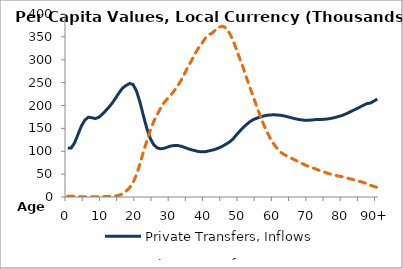
| Category | Private Transfers, Inflows | Private Transfers, Outflows |
|---|---|---|
| 0 | 106772.516 | 1768.943 |
|  | 107047.771 | 1618.705 |
| 2 | 118338.493 | 1308.319 |
| 3 | 137116.809 | 984.809 |
| 4 | 155432.478 | 714.118 |
| 5 | 168279.85 | 540.451 |
| 6 | 174393.681 | 500.596 |
| 7 | 173274.096 | 597.455 |
| 8 | 171427.268 | 726.342 |
| 9 | 173912.937 | 823.663 |
| 10 | 180404.959 | 948.097 |
| 11 | 188372.778 | 1099.228 |
| 12 | 196466.473 | 1232.339 |
| 13 | 205875.574 | 1503 |
| 14 | 217031.85 | 2323.006 |
| 15 | 228593.258 | 3923.878 |
| 16 | 238477.571 | 7207.892 |
| 17 | 243957.126 | 12734.552 |
| 18 | 248204.689 | 20255.204 |
| 19 | 245794.285 | 31406.597 |
| 20 | 231627.89 | 48548.577 |
| 21 | 207485.979 | 72342.712 |
| 22 | 177919.206 | 98365.689 |
| 23 | 149773.347 | 122657.077 |
| 24 | 128021.267 | 145454.917 |
| 25 | 114308.443 | 165023.85 |
| 26 | 107425.506 | 180025.347 |
| 27 | 105357.074 | 193733.777 |
| 28 | 106436.59 | 206019.411 |
| 29 | 109008.128 | 214867.266 |
| 30 | 111397.952 | 222943.601 |
| 31 | 112664.942 | 232385.904 |
| 32 | 112584.229 | 243312.256 |
| 33 | 110776.639 | 255400.224 |
| 34 | 108328.284 | 270041.903 |
| 35 | 105439.063 | 284845.392 |
| 36 | 103219.607 | 298338.74 |
| 37 | 101331.055 | 312905.467 |
| 38 | 99422.665 | 325393.293 |
| 39 | 98658.473 | 335749.313 |
| 40 | 98947.858 | 347095.264 |
| 41 | 100777.524 | 354242.358 |
| 42 | 102371.493 | 358513.132 |
| 43 | 104568.474 | 364930.528 |
| 44 | 107525.144 | 371144.62 |
| 45 | 111018.882 | 373357.706 |
| 46 | 115488.59 | 369589.758 |
| 47 | 120056.57 | 358424.253 |
| 48 | 126375.111 | 343918.447 |
| 49 | 135235.95 | 323688.24 |
| 50 | 143772.629 | 302847.411 |
| 51 | 151677.003 | 282732.77 |
| 52 | 158531.27 | 260394.473 |
| 53 | 164816.546 | 239243.109 |
| 54 | 169324.71 | 218080.151 |
| 55 | 172297.451 | 197010.836 |
| 56 | 175018.503 | 176313.814 |
| 57 | 177189.204 | 157636.366 |
| 58 | 178598.871 | 141062.48 |
| 59 | 179391.393 | 126535.309 |
| 60 | 179660.412 | 114713.016 |
| 61 | 179229.49 | 104981.507 |
| 62 | 178435.18 | 97407.665 |
| 63 | 177078.292 | 92237.97 |
| 64 | 175278.217 | 88473.484 |
| 65 | 173249.065 | 84795.85 |
| 66 | 171316.963 | 81178.037 |
| 67 | 169679.929 | 77401.664 |
| 68 | 168541.33 | 73828.442 |
| 69 | 167661.768 | 70118.373 |
| 70 | 167738.518 | 66747.823 |
| 71 | 168278.487 | 64125.381 |
| 72 | 169228.219 | 61644.008 |
| 73 | 169157.154 | 58515.389 |
| 74 | 169469.807 | 55969.854 |
| 75 | 170200.85 | 53347.333 |
| 76 | 171120.705 | 50872.848 |
| 77 | 172525.444 | 48743.685 |
| 78 | 174374.281 | 46985.099 |
| 79 | 176471.388 | 45380.551 |
| 80 | 178933.302 | 44064.006 |
| 81 | 182024.451 | 42081.827 |
| 82 | 185631.488 | 39959.332 |
| 83 | 189305.778 | 37928.215 |
| 84 | 192991.208 | 35980.419 |
| 85 | 196784.762 | 33821.391 |
| 86 | 200553.305 | 31620.004 |
| 87 | 204323.026 | 29365.12 |
| 88 | 205330.161 | 25524.447 |
| 89 | 209591.741 | 23181.75 |
| 90+ | 214090.491 | 20612.221 |